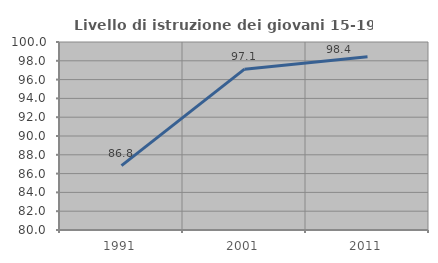
| Category | Livello di istruzione dei giovani 15-19 anni |
|---|---|
| 1991.0 | 86.849 |
| 2001.0 | 97.111 |
| 2011.0 | 98.441 |